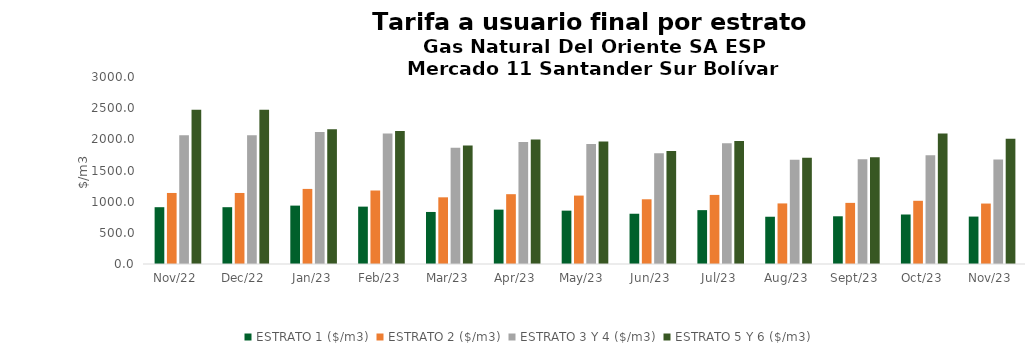
| Category | ESTRATO 1 ($/m3) | ESTRATO 2 ($/m3) | ESTRATO 3 Y 4 ($/m3) | ESTRATO 5 Y 6 ($/m3) |
|---|---|---|---|---|
| 2022-11-01 | 911.27 | 1139.55 | 2063.64 | 2476.368 |
| 2022-12-01 | 911.27 | 1139.55 | 2063.64 | 2476.368 |
| 2023-01-01 | 936.76 | 1204.6 | 2117.59 | 2159.942 |
| 2023-02-01 | 920.36 | 1179.08 | 2091.73 | 2133.565 |
| 2023-03-01 | 834.84 | 1069.75 | 1864.96 | 1902.259 |
| 2023-04-01 | 872.23 | 1119.98 | 1956.98 | 1996.12 |
| 2023-05-01 | 856.04 | 1097.58 | 1926.46 | 1964.989 |
| 2023-06-01 | 806.28 | 1038.3 | 1778.05 | 1813.611 |
| 2023-07-01 | 864.11 | 1108.42 | 1935.47 | 1974.179 |
| 2023-08-01 | 758.17 | 971.8 | 1672.03 | 1705.471 |
| 2023-09-01 | 765.41 | 980.53 | 1679.03 | 1712.611 |
| 2023-10-01 | 794.12 | 1014.06 | 1746.12 | 2095.344 |
| 2023-11-01 | 760.84 | 969.81 | 1675.45 | 2010.54 |